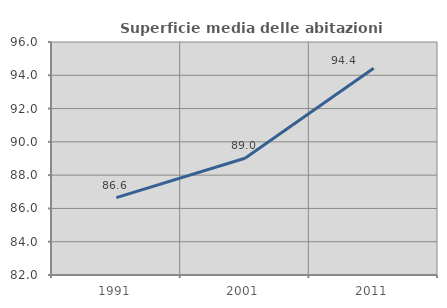
| Category | Superficie media delle abitazioni occupate |
|---|---|
| 1991.0 | 86.647 |
| 2001.0 | 89.015 |
| 2011.0 | 94.425 |